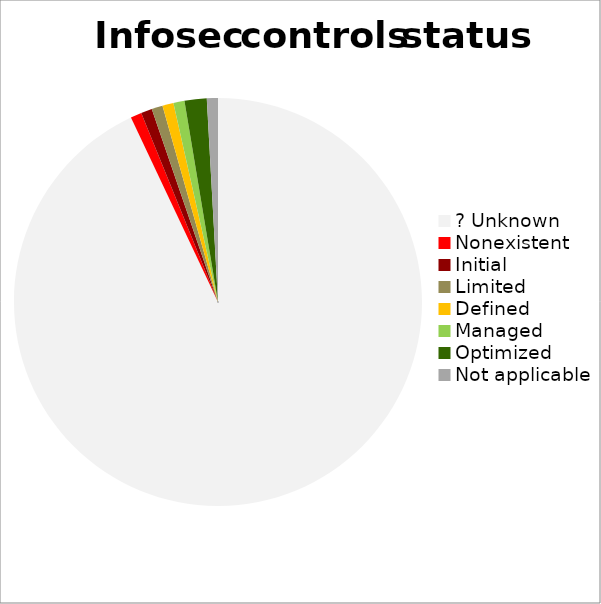
| Category | Proportion of information security controls |
|---|---|
| ? Unknown | 0.93 |
| Nonexistent | 0.009 |
| Initial | 0.009 |
| Limited | 0.009 |
| Defined | 0.009 |
| Managed | 0.009 |
| Optimized | 0.018 |
| Not applicable | 0.009 |